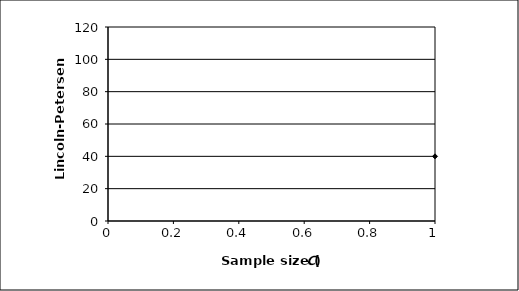
| Category | Series 0 |
|---|---|
| 0 | 40 |
| 1 | 30 |
| 2 | 40 |
| 3 | 50 |
| 4 | 60 |
| 5 | 46.667 |
| 6 | 53.333 |
| 7 | 60 |
| 8 | 66.667 |
| 9 | 73.333 |
| 10 | 80 |
| 11 | 86.667 |
| 12 | 93.333 |
| 13 | 100 |
| 14 | 106.667 |
| 15 | 85 |
| 16 | 72 |
| 17 | 76 |
| 18 | 66.667 |
| 19 | 60 |
| 20 | 55 |
| 21 | 57.5 |
| 22 | 60 |
| 23 | 62.5 |
| 24 | 65 |
| 25 | 67.5 |
| 26 | 70 |
| 27 | 72.5 |
| 28 | 75 |
| 29 | 68.889 |
| 30 | 71.111 |
| 31 | 73.333 |
| 32 | 75.556 |
| 33 | 70 |
| 34 | 72 |
| 35 | 67.273 |
| 36 | 69.091 |
| 37 | 70.909 |
| 38 | 72.727 |
| 39 | 68.333 |
| 40 | 64.615 |
| 41 | 66.154 |
| 42 | 62.857 |
| 43 | 64.286 |
| 44 | 61.333 |
| 45 | 62.667 |
| 46 | 64 |
| 47 | 65.333 |
| 48 | 66.667 |
| 49 | 68 |
| 50 | 69.333 |
| 51 | 66.25 |
| 52 | 67.5 |
| 53 | 64.706 |
| 54 | 62.222 |
| 55 | 63.333 |
| 56 | 64.444 |
| 57 | 65.556 |
| 58 | 66.667 |
| 59 | 67.778 |
| 60 | 68.889 |
| 61 | 66.316 |
| 62 | 67.368 |
| 63 | 68.421 |
| 64 | 66 |
| 65 | 67 |
| 66 | 68 |
| 67 | 69 |
| 68 | 66.667 |
| 69 | 67.619 |
| 70 | 68.571 |
| 71 | 66.364 |
| 72 | 67.273 |
| 73 | 68.182 |
| 74 | 66.087 |
| 75 | 66.957 |
| 76 | 67.826 |
| 77 | 68.696 |
| 78 | 66.667 |
| 79 | 67.5 |
| 80 | 68.333 |
| 81 | 66.4 |
| 82 | 64.615 |
| 83 | 65.385 |
| 84 | 66.154 |
| 85 | 66.923 |
| 86 | 67.692 |
| 87 | 68.462 |
| 88 | 69.231 |
| 89 | 70 |
| 90 | 68.148 |
| 91 | 68.889 |
| 92 | 67.143 |
| 93 | 67.857 |
| 94 | 68.571 |
| 95 | 69.286 |
| 96 | 70 |
| 97 | 70.714 |
| 98 | 68.966 |
| 99 | 69.655 |